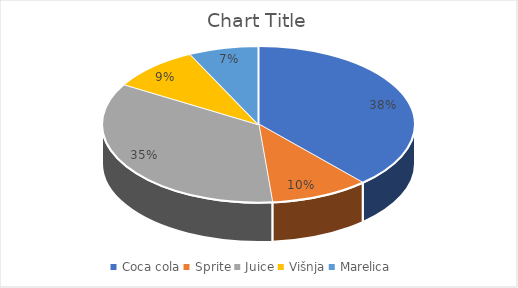
| Category | Series 0 |
|---|---|
| Coca cola | 1353 |
| Sprite | 359.04 |
| Juice | 1230.845 |
| Višnja | 326.562 |
| Marelica | 253.688 |